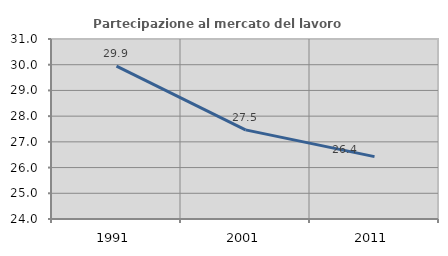
| Category | Partecipazione al mercato del lavoro  femminile |
|---|---|
| 1991.0 | 29.942 |
| 2001.0 | 27.466 |
| 2011.0 | 26.426 |